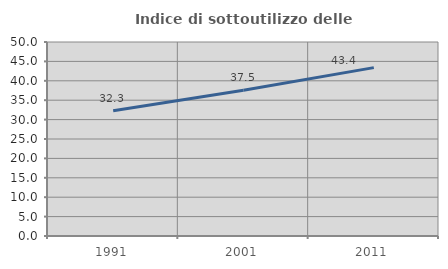
| Category | Indice di sottoutilizzo delle abitazioni  |
|---|---|
| 1991.0 | 32.275 |
| 2001.0 | 37.549 |
| 2011.0 | 43.392 |